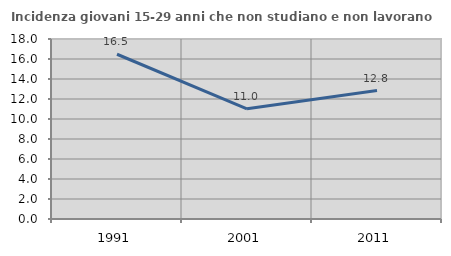
| Category | Incidenza giovani 15-29 anni che non studiano e non lavorano  |
|---|---|
| 1991.0 | 16.475 |
| 2001.0 | 11.018 |
| 2011.0 | 12.847 |